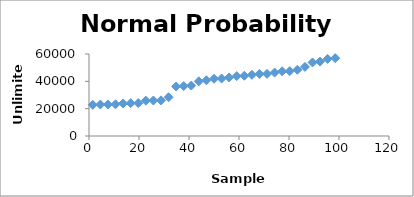
| Category | Series 0 |
|---|---|
| 1.5151515151515151 | 22811.2 |
| 4.545454545454545 | 23036.3 |
| 7.575757575757576 | 23062.7 |
| 10.606060606060606 | 23187.1 |
| 13.636363636363637 | 23829.5 |
| 16.666666666666668 | 24021 |
| 19.696969696969695 | 24080.1 |
| 22.727272727272727 | 25862.2 |
| 25.757575757575758 | 25953.7 |
| 28.78787878787879 | 26056.4 |
| 31.81818181818182 | 28346.1 |
| 34.84848484848485 | 36230.9 |
| 37.878787878787875 | 36544.5 |
| 40.90909090909091 | 36925 |
| 43.93939393939394 | 40031.4 |
| 46.96969696969697 | 40760.3 |
| 50.0 | 41888.3 |
| 53.03030303030303 | 42042 |
| 56.06060606060606 | 42858.2 |
| 59.09090909090909 | 43829.6 |
| 62.121212121212125 | 44082 |
| 65.15151515151514 | 44737.6 |
| 68.18181818181819 | 45430.8 |
| 71.21212121212122 | 45435.9 |
| 74.24242424242424 | 46410 |
| 77.27272727272727 | 47342 |
| 80.3030303030303 | 47438.5 |
| 83.33333333333333 | 48440.7 |
| 86.36363636363636 | 50562.6 |
| 89.39393939393939 | 53795.2 |
| 92.42424242424242 | 54445.1 |
| 95.45454545454545 | 56423.7 |
| 98.48484848484848 | 56976.5 |